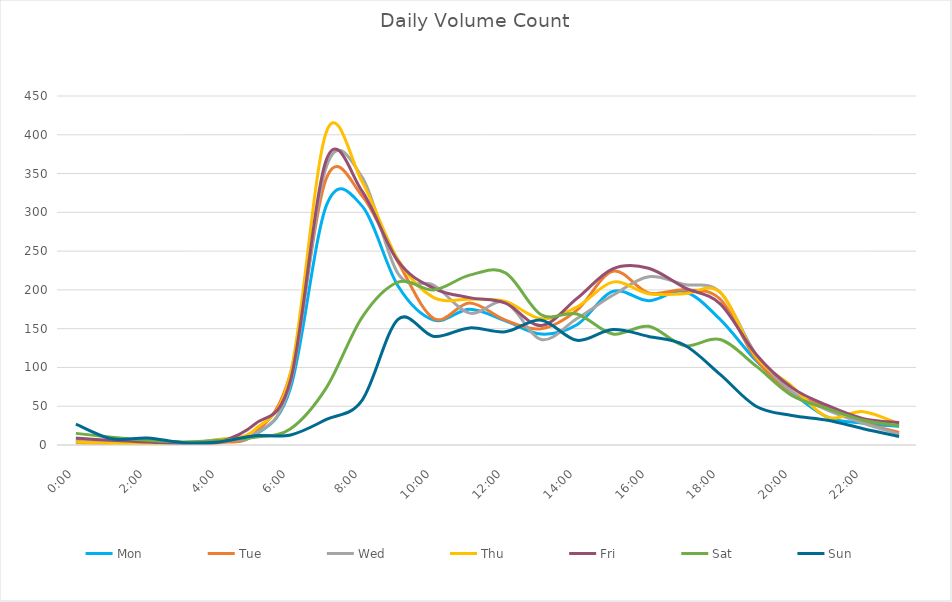
| Category | Mon | Tue | Wed | Thu | Fri | Sat | Sun |
|---|---|---|---|---|---|---|---|
| 0.0 | 6 | 3 | 5 | 4 | 9 | 15 | 27 |
| 0.0416666666666667 | 2 | 2 | 5 | 2 | 6 | 10 | 8 |
| 0.0833333333333333 | 3 | 1 | 3 | 2 | 4 | 6 | 9 |
| 0.125 | 3 | 0 | 2 | 2 | 2 | 4 | 3 |
| 0.166666666666667 | 4 | 3 | 7 | 7 | 4 | 6 | 4 |
| 0.208333333333333 | 13 | 15 | 14 | 20 | 27 | 10 | 12 |
| 0.25 | 74 | 93 | 80 | 93 | 84 | 21 | 13 |
| 0.291666666666667 | 309 | 344 | 359 | 404 | 368 | 74 | 33 |
| 0.333333333333333 | 308 | 321 | 345 | 339 | 327 | 165 | 58 |
| 0.375 | 205 | 236 | 221 | 239 | 237 | 210 | 162 |
| 0.416666666666667 | 161 | 163 | 206 | 190 | 202 | 200 | 140 |
| 0.4583333333333333 | 175 | 183 | 170 | 188 | 190 | 219 | 151 |
| 0.5 | 160 | 161 | 184 | 185 | 183 | 222 | 146 |
| 0.541666666666667 | 143 | 150 | 136 | 163 | 154 | 168 | 161 |
| 0.5833333333333334 | 155 | 174 | 163 | 178 | 189 | 169 | 135 |
| 0.625 | 198 | 224 | 193 | 210 | 227 | 143 | 149 |
| 0.666666666666667 | 186 | 196 | 217 | 195 | 228 | 153 | 140 |
| 0.7083333333333334 | 198 | 200 | 207 | 195 | 203 | 128 | 129 |
| 0.75 | 162 | 188 | 197 | 197 | 182 | 136 | 91 |
| 0.791666666666667 | 109 | 111 | 117 | 114 | 117 | 102 | 50 |
| 0.8333333333333334 | 68 | 67 | 69 | 76 | 74 | 64 | 38 |
| 0.875 | 36 | 50 | 45 | 36 | 51 | 47 | 32 |
| 0.916666666666667 | 28 | 29 | 28 | 43 | 34 | 32 | 21 |
| 0.9583333333333334 | 24 | 16 | 14 | 27 | 29 | 25 | 11 |